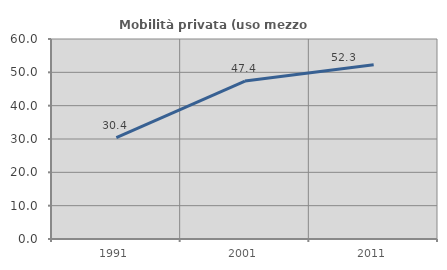
| Category | Mobilità privata (uso mezzo privato) |
|---|---|
| 1991.0 | 30.41 |
| 2001.0 | 47.368 |
| 2011.0 | 52.275 |